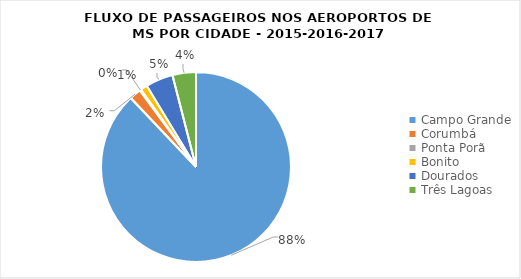
| Category | Series 0 |
|---|---|
| Campo Grande | 4551447 |
| Corumbá | 103453 |
| Ponta Porã | 11305 |
| Bonito | 60516 |
| Dourados | 242192 |
| Três Lagoas | 207005 |